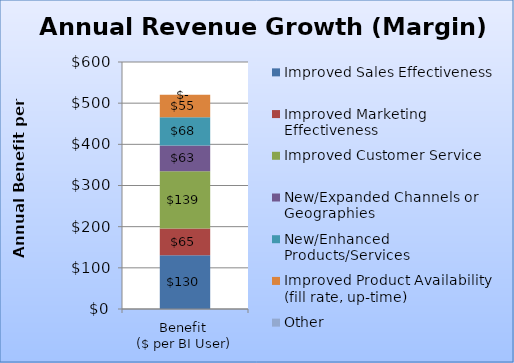
| Category | Improved Sales Effectiveness | Improved Marketing Effectiveness | Improved Customer Service | New/Expanded Channels or Geographies | New/Enhanced Products/Services | Improved Product Availability (fill rate, up-time) | Other |
|---|---|---|---|---|---|---|---|
| Benefit 
($ per BI User) | 130.367 | 65.184 | 138.793 | 62.798 | 68.473 | 54.532 | 0 |